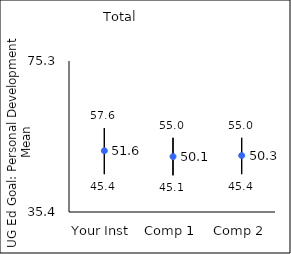
| Category | 25th percentile | 75th percentile | Mean |
|---|---|---|---|
| Your Inst | 45.4 | 57.6 | 51.58 |
| Comp 1 | 45.1 | 55 | 50.05 |
| Comp 2 | 45.4 | 55 | 50.32 |